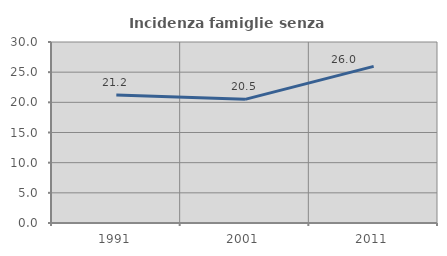
| Category | Incidenza famiglie senza nuclei |
|---|---|
| 1991.0 | 21.212 |
| 2001.0 | 20.495 |
| 2011.0 | 25.964 |